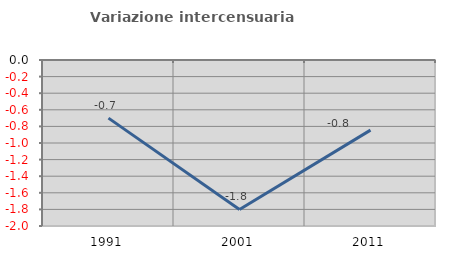
| Category | Variazione intercensuaria annua |
|---|---|
| 1991.0 | -0.7 |
| 2001.0 | -1.801 |
| 2011.0 | -0.845 |